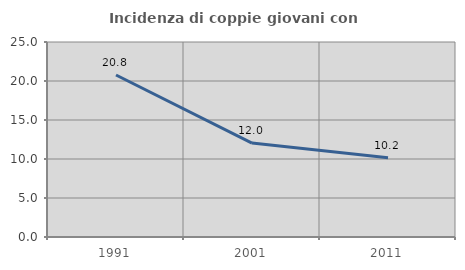
| Category | Incidenza di coppie giovani con figli |
|---|---|
| 1991.0 | 20.765 |
| 2001.0 | 12.042 |
| 2011.0 | 10.169 |